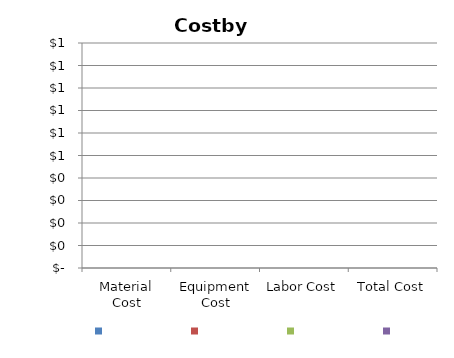
| Category |   |
|---|---|
| Material Cost | 0 |
| Equipment Cost | 0 |
| Labor Cost | 0 |
| Total Cost | 0 |